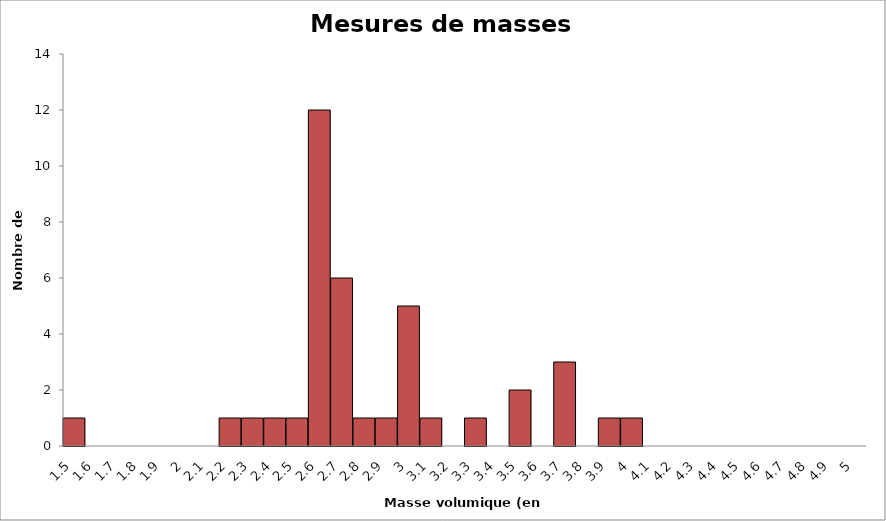
| Category | Series 1 |
|---|---|
| 1.5 | 1 |
| 1.6 | 0 |
| 1.7 | 0 |
| 1.8 | 0 |
| 1.9 | 0 |
| 2.0 | 0 |
| 2.1 | 0 |
| 2.2 | 1 |
| 2.3 | 1 |
| 2.4 | 1 |
| 2.5 | 1 |
| 2.6 | 12 |
| 2.7 | 6 |
| 2.8 | 1 |
| 2.9 | 1 |
| 3.0 | 5 |
| 3.1 | 1 |
| 3.2 | 0 |
| 3.3 | 1 |
| 3.4 | 0 |
| 3.5 | 2 |
| 3.6 | 0 |
| 3.7 | 3 |
| 3.8 | 0 |
| 3.9 | 1 |
| 4.0 | 1 |
| 4.1 | 0 |
| 4.2 | 0 |
| 4.3 | 0 |
| 4.4 | 0 |
| 4.5 | 0 |
| 4.6 | 0 |
| 4.7 | 0 |
| 4.8 | 0 |
| 4.9 | 0 |
| 5.0 | 0 |